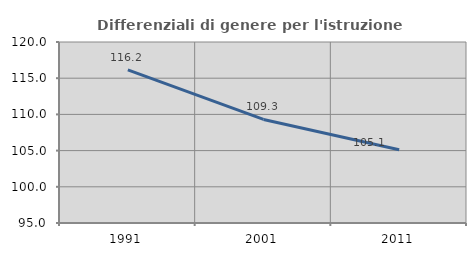
| Category | Differenziali di genere per l'istruzione superiore |
|---|---|
| 1991.0 | 116.153 |
| 2001.0 | 109.302 |
| 2011.0 | 105.116 |